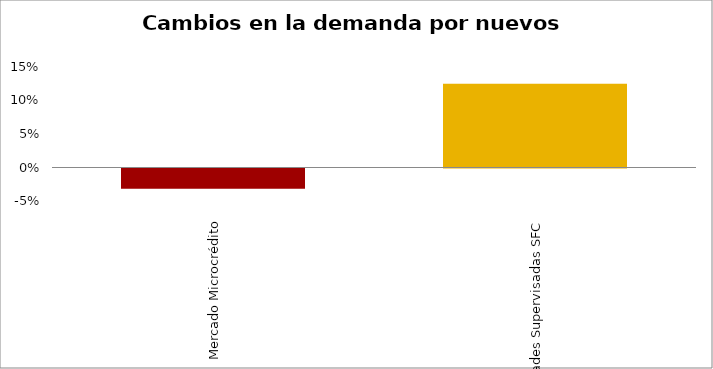
| Category | Microcrédito |
|---|---|
| Mercado Microcrédito | -0.03 |
| Entidades Supervisadas SFC | 0.125 |